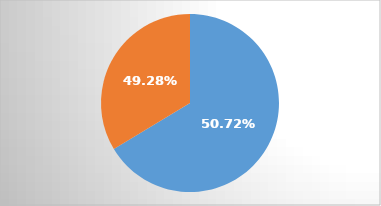
| Category | Series 0 |
|---|---|
| 0 | 3034570 |
| 1 | 1539052.55 |